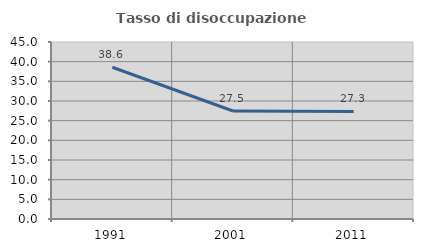
| Category | Tasso di disoccupazione giovanile  |
|---|---|
| 1991.0 | 38.585 |
| 2001.0 | 27.452 |
| 2011.0 | 27.346 |